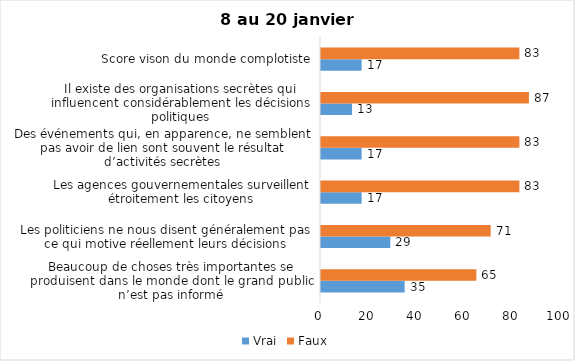
| Category | Vrai | Faux |
|---|---|---|
| Beaucoup de choses très importantes se produisent dans le monde dont le grand public n’est pas informé | 35 | 65 |
| Les politiciens ne nous disent généralement pas ce qui motive réellement leurs décisions | 29 | 71 |
| Les agences gouvernementales surveillent étroitement les citoyens | 17 | 83 |
| Des événements qui, en apparence, ne semblent pas avoir de lien sont souvent le résultat d’activités secrètes | 17 | 83 |
| Il existe des organisations secrètes qui influencent considérablement les décisions politiques | 13 | 87 |
| Score vison du monde complotiste | 17 | 83 |